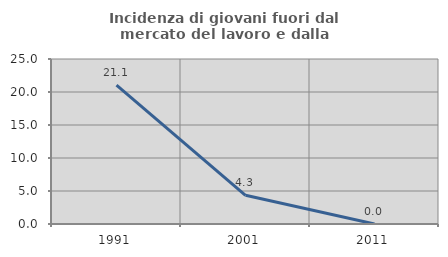
| Category | Incidenza di giovani fuori dal mercato del lavoro e dalla formazione  |
|---|---|
| 1991.0 | 21.053 |
| 2001.0 | 4.348 |
| 2011.0 | 0 |